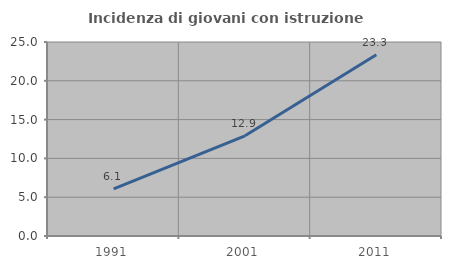
| Category | Incidenza di giovani con istruzione universitaria |
|---|---|
| 1991.0 | 6.067 |
| 2001.0 | 12.915 |
| 2011.0 | 23.349 |